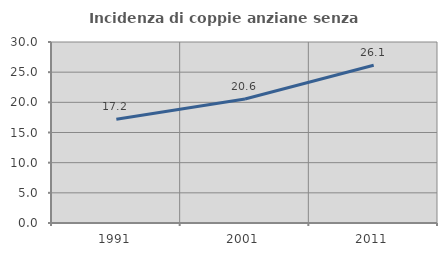
| Category | Incidenza di coppie anziane senza figli  |
|---|---|
| 1991.0 | 17.188 |
| 2001.0 | 20.561 |
| 2011.0 | 26.136 |